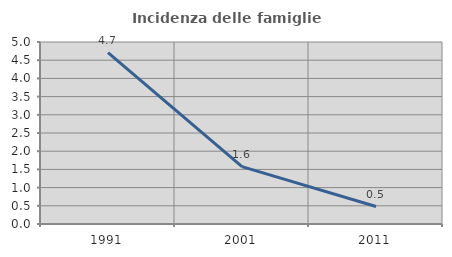
| Category | Incidenza delle famiglie numerose |
|---|---|
| 1991.0 | 4.706 |
| 2001.0 | 1.576 |
| 2011.0 | 0.479 |